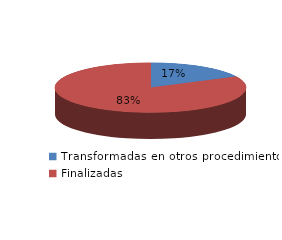
| Category | Series 0 |
|---|---|
| Transformadas en otros procedimientos | 3003 |
| Finalizadas | 14202 |